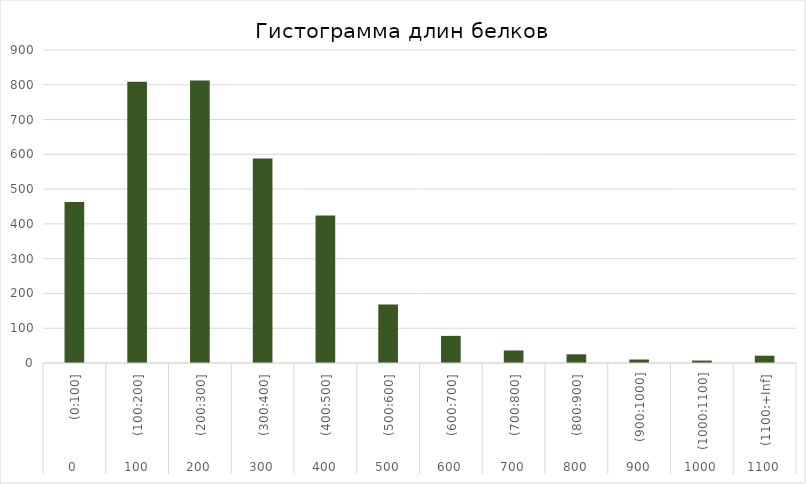
| Category | Series 0 |
|---|---|
| 0 | 463 |
| 1 | 809 |
| 2 | 812 |
| 3 | 588 |
| 4 | 424 |
| 5 | 168 |
| 6 | 78 |
| 7 | 36 |
| 8 | 25 |
| 9 | 10 |
| 10 | 7 |
| 11 | 21 |